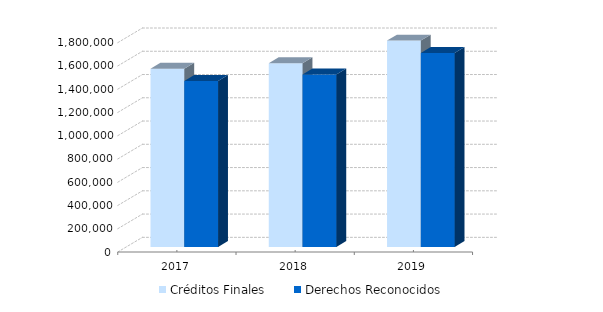
| Category | Créditos Finales | Derechos Reconocidos |
|---|---|---|
| 2017.0 | 1532378 | 1427188 |
| 2018.0 | 1579757.67 | 1483015.56 |
| 2019.0 | 1774024.81 | 1668299.76 |